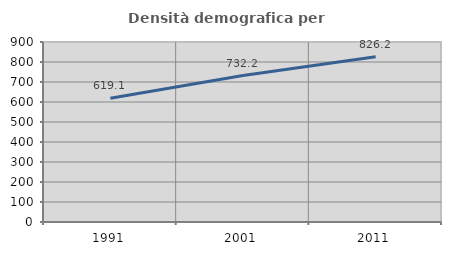
| Category | Densità demografica |
|---|---|
| 1991.0 | 619.081 |
| 2001.0 | 732.181 |
| 2011.0 | 826.165 |